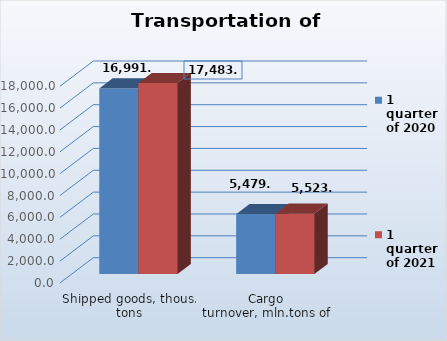
| Category | 1 quarter of 2020 | 1 quarter of 2021 |
|---|---|---|
| Shipped goods, thous. tons | 16991.5 | 17483.8 |
| Cargo turnover, mln.tons of km | 5479.2 | 5523.5 |